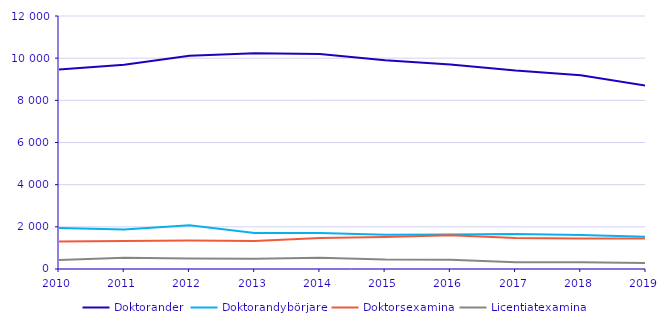
| Category | Doktorander | Doktorandybörjare | Doktorsexamina | Licentiatexamina |
|---|---|---|---|---|
| 2010.0 | 9459 | 1950 | 1306 | 428 |
| 2011.0 | 9689 | 1871 | 1329 | 528 |
| 2012.0 | 10116 | 2075 | 1354 | 501 |
| 2013.0 | 10233 | 1711 | 1332 | 482 |
| 2014.0 | 10197 | 1713 | 1465 | 529 |
| 2015.0 | 9900 | 1621 | 1516 | 445 |
| 2016.0 | 9702 | 1638 | 1603 | 435 |
| 2017.0 | 9414 | 1663 | 1469 | 322 |
| 2018.0 | 9195 | 1612 | 1448 | 320 |
| 2019.0 | 8691 | 1523 | 1444 | 288 |